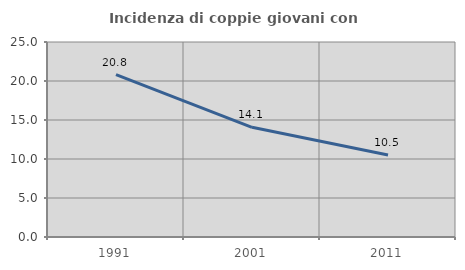
| Category | Incidenza di coppie giovani con figli |
|---|---|
| 1991.0 | 20.805 |
| 2001.0 | 14.064 |
| 2011.0 | 10.506 |